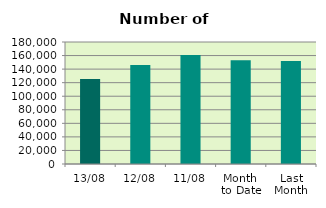
| Category | Series 0 |
|---|---|
| 13/08 | 125350 |
| 12/08 | 146170 |
| 11/08 | 160958 |
| Month 
to Date | 153099.556 |
| Last
Month | 152026.87 |